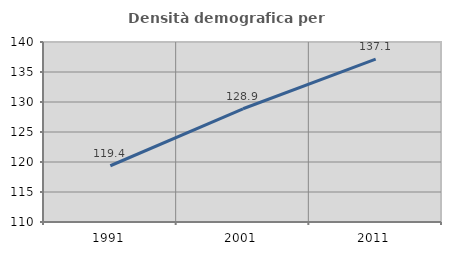
| Category | Densità demografica |
|---|---|
| 1991.0 | 119.375 |
| 2001.0 | 128.874 |
| 2011.0 | 137.135 |